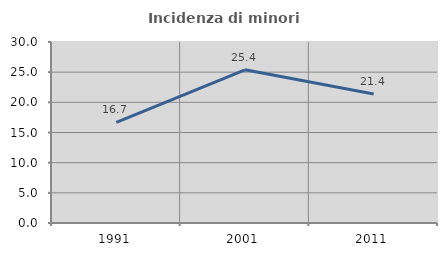
| Category | Incidenza di minori stranieri |
|---|---|
| 1991.0 | 16.667 |
| 2001.0 | 25.397 |
| 2011.0 | 21.368 |